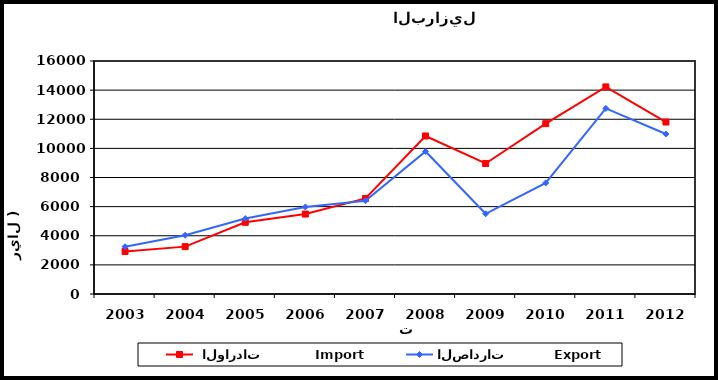
| Category |  الواردات           Import | الصادرات          Export |
|---|---|---|
| 2003.0 | 2919 | 3249 |
| 2004.0 | 3253 | 4038 |
| 2005.0 | 4922 | 5178 |
| 2006.0 | 5490 | 5977 |
| 2007.0 | 6564 | 6405 |
| 2008.0 | 10851 | 9790 |
| 2009.0 | 8964 | 5509 |
| 2010.0 | 11699 | 7627 |
| 2011.0 | 14222 | 12746 |
| 2012.0 | 11810 | 10987 |